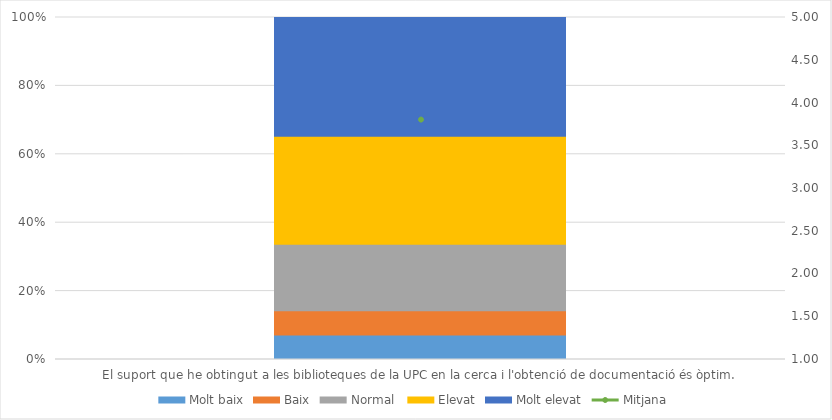
| Category | Molt baix | Baix | Normal  | Elevat | Molt elevat |
|---|---|---|---|---|---|
| El suport que he obtingut a les biblioteques de la UPC en la cerca i l'obtenció de documentació és òptim. | 7 | 7 | 19 | 31 | 34 |